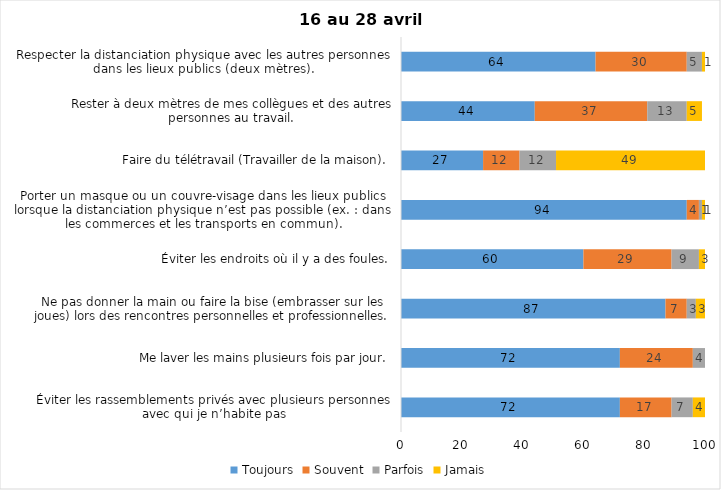
| Category | Toujours | Souvent | Parfois | Jamais |
|---|---|---|---|---|
| Éviter les rassemblements privés avec plusieurs personnes avec qui je n’habite pas | 72 | 17 | 7 | 4 |
| Me laver les mains plusieurs fois par jour. | 72 | 24 | 4 | 0 |
| Ne pas donner la main ou faire la bise (embrasser sur les joues) lors des rencontres personnelles et professionnelles. | 87 | 7 | 3 | 3 |
| Éviter les endroits où il y a des foules. | 60 | 29 | 9 | 3 |
| Porter un masque ou un couvre-visage dans les lieux publics lorsque la distanciation physique n’est pas possible (ex. : dans les commerces et les transports en commun). | 94 | 4 | 1 | 1 |
| Faire du télétravail (Travailler de la maison). | 27 | 12 | 12 | 49 |
| Rester à deux mètres de mes collègues et des autres personnes au travail. | 44 | 37 | 13 | 5 |
| Respecter la distanciation physique avec les autres personnes dans les lieux publics (deux mètres). | 64 | 30 | 5 | 1 |